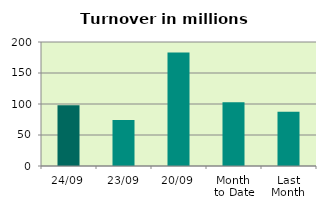
| Category | Series 0 |
|---|---|
| 24/09 | 97.817 |
| 23/09 | 74.334 |
| 20/09 | 183.118 |
| Month 
to Date | 102.819 |
| Last
Month | 87.619 |